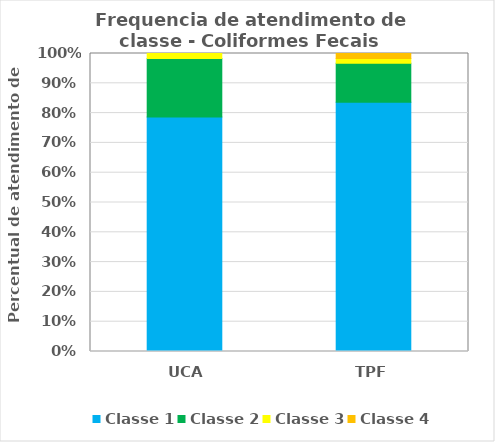
| Category | Classe 1 | Classe 2 | Classe 3 | Classe 4 |
|---|---|---|---|---|
| UCA | 0.787 | 0.197 | 0.016 | 0 |
| TPF | 0.836 | 0.131 | 0.016 | 0.016 |